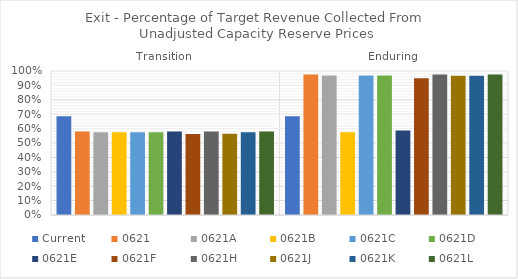
| Category | Current | 0621 | 0621A | 0621B | 0621C | 0621D | 0621E | 0621F | 0621H | 0621J | 0621K | 0621L |
|---|---|---|---|---|---|---|---|---|---|---|---|---|
| Transition | 0.686 | 0.58 | 0.575 | 0.575 | 0.575 | 0.575 | 0.58 | 0.562 | 0.58 | 0.564 | 0.575 | 0.58 |
| Enduring | 0.686 | 0.976 | 0.969 | 0.575 | 0.969 | 0.969 | 0.587 | 0.95 | 0.976 | 0.967 | 0.967 | 0.976 |